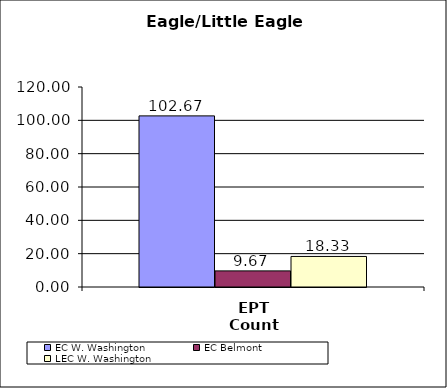
| Category | EC W. Washington | EC Belmont | LEC W. Washington |
|---|---|---|---|
| EPT Count | 102.667 | 9.667 | 18.333 |